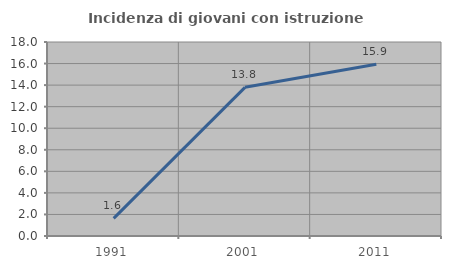
| Category | Incidenza di giovani con istruzione universitaria |
|---|---|
| 1991.0 | 1.639 |
| 2001.0 | 13.793 |
| 2011.0 | 15.942 |